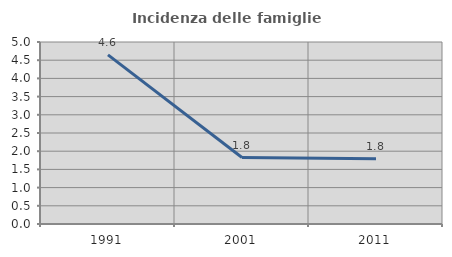
| Category | Incidenza delle famiglie numerose |
|---|---|
| 1991.0 | 4.647 |
| 2001.0 | 1.826 |
| 2011.0 | 1.79 |